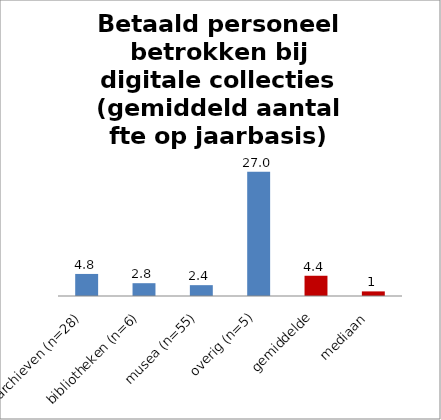
| Category | Gem. aantal fte |
|---|---|
| archieven (n=28) | 4.795 |
| bibliotheken (n=6) | 2.783 |
| musea (n=55) | 2.358 |
| overig (n=5) | 27 |
| gemiddelde | 4.4 |
| mediaan  | 1 |